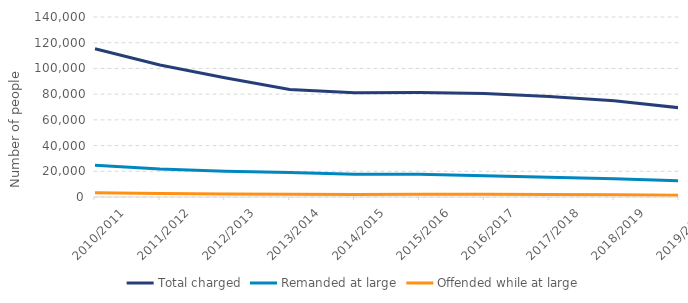
| Category | Total charged | Remanded at large | Offended while at large |
|---|---|---|---|
| 2010/2011 | 115257 | 24682 | 3233 |
| 2011/2012 | 102707 | 21712 | 2634 |
| 2012/2013 | 92676 | 20070 | 2266 |
| 2013/2014 | 83619 | 19128 | 2115 |
| 2014/2015 | 81111 | 17664 | 2031 |
| 2015/2016 | 81363 | 17754 | 2161 |
| 2016/2017 | 80526 | 16595 | 2159 |
| 2017/2018 | 78106 | 15339 | 1972 |
| 2018/2019 | 74909 | 14143 | 1678 |
| 2019/2020 | 69432 | 12642 | 1405 |